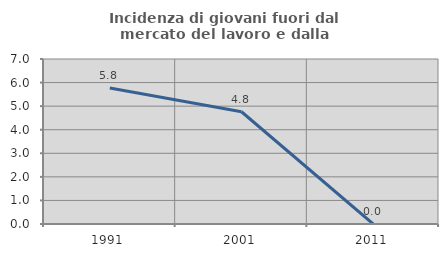
| Category | Incidenza di giovani fuori dal mercato del lavoro e dalla formazione  |
|---|---|
| 1991.0 | 5.769 |
| 2001.0 | 4.762 |
| 2011.0 | 0 |